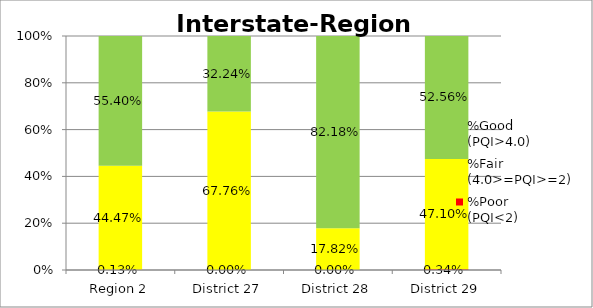
| Category | %Poor
(PQI<2) | %Fair
(4.0>=PQI>=2) | %Good
(PQI>4.0) |
|---|---|---|---|
| Region 2 | 0.001 | 0.445 | 0.554 |
| District 27 | 0 | 0.678 | 0.322 |
| District 28 | 0 | 0.178 | 0.822 |
| District 29 | 0.003 | 0.471 | 0.526 |